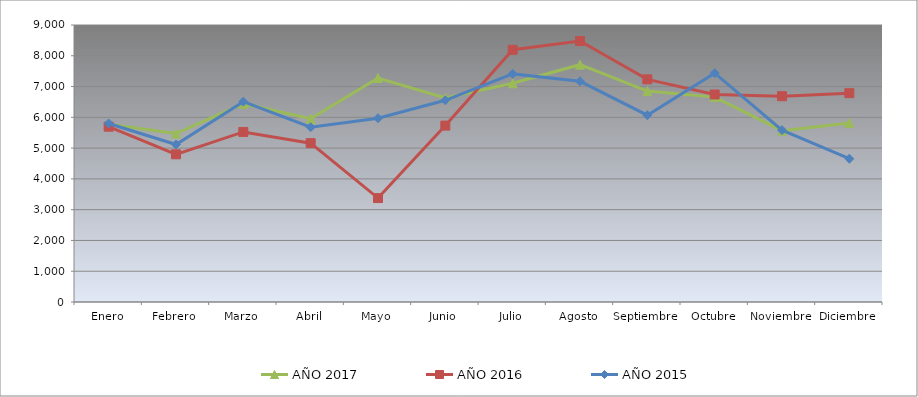
| Category | AÑO 2017 | AÑO 2016 | AÑO 2015 |
|---|---|---|---|
| Enero | 5776.624 | 5696.465 | 5800.149 |
| Febrero | 5472.661 | 4798.785 | 5116.883 |
| Marzo | 6443.209 | 5525.538 | 6510.649 |
| Abril | 5955.713 | 5161.029 | 5679.462 |
| Mayo | 7277.551 | 3376.997 | 5971.299 |
| Junio | 6626.742 | 5730.952 | 6553.904 |
| Julio | 7106.016 | 8194.914 | 7411.523 |
| Agosto | 7710.609 | 8478.114 | 7171.219 |
| Septiembre | 6852.936 | 7234.301 | 6069.824 |
| Octubre | 6657.405 | 6742.667 | 7436.355 |
| Noviembre | 5565.317 | 6687.286 | 5584.943 |
| Diciembre | 5814.842 | 6784.958 | 4656.032 |